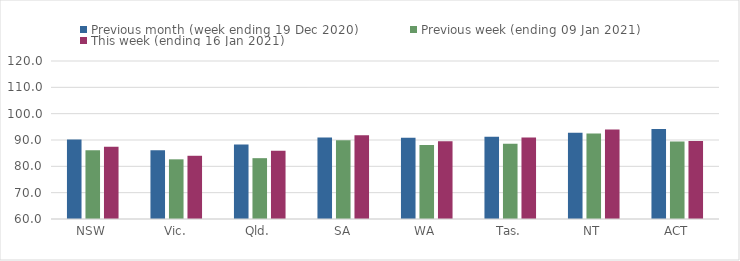
| Category | Previous month (week ending 19 Dec 2020) | Previous week (ending 09 Jan 2021) | This week (ending 16 Jan 2021) |
|---|---|---|---|
| NSW | 90.17 | 86.13 | 87.41 |
| Vic. | 86.08 | 82.66 | 84.01 |
| Qld. | 88.25 | 83.1 | 85.88 |
| SA | 90.97 | 89.93 | 91.84 |
| WA | 90.89 | 88.11 | 89.52 |
| Tas. | 91.2 | 88.57 | 90.96 |
| NT | 92.75 | 92.45 | 93.99 |
| ACT | 94.14 | 89.43 | 89.6 |